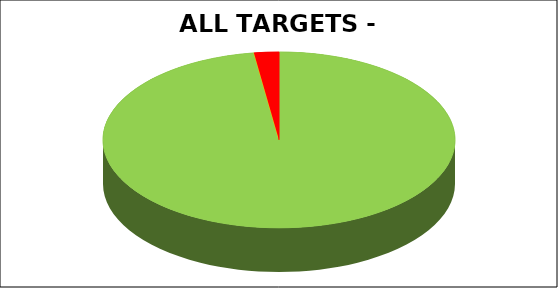
| Category | Series 0 |
|---|---|
| Green | 0.977 |
| Amber | 0 |
| Red | 0.023 |